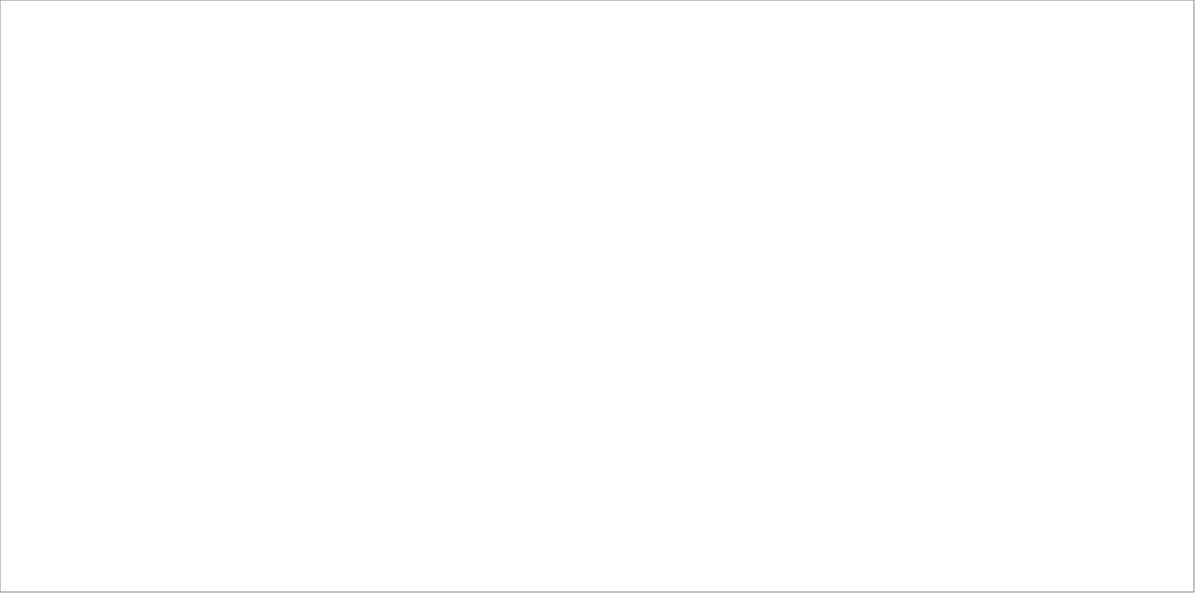
| Category | Series 0 |
|---|---|
| Meža ieaudzēšana, apmežošana  | 24 |
| Mežaudžu atjaunošana pēc ugunsgrēka, vējgāzes, snieglauzes u. tml.  | 21 |
| Stādmateriāla iegāde meža atjaunošanā, stādu aizsardzība pret meža dzīvnieku postījumiem | 17 |
| Apmācību un pieredzes apmaiņas pasākumi meža īpašniekiem Latvijā un ārzemēs  | 11 |
| Atbalsts meža īpašnieku kooperatīvu izveidei un darbībai  | 10 |
| Atbalsts jaunam meža īpašniekam, pārņemot īpašumu no vecākiem | 5 |
| Ātraudzīgu stādījumu (kārklu, baltalkšņu) ierīkošana šķeldas ieguvei | 7 |
| Meža meliorācijas sistēmu un ceļu uzlabošana, izbūve | 27 |
| Kompensācijas par valsts noteiktajiem mežsaimnieciskās darbības ierobežojumiem | 27 |
| Konsultācijas par meža apsaimniekošanu, apsaimniekošanas plānu izstrāde | 11 |
| Jaunaudžu kopšana, mazvērtīgu mežaudžu nomaiņa | 32 |
| Motorinstrumentu, īpaši meža darbiem piemērotas mazās un vidējas tehnikas iegāde | 18 |
| Atbalsts meža īpašnieka brīvprātīgi izvēlētām apsaimniekošanas metodēm, palielinot meža sociālās un vides vērtības, sākotnējai meža sertifikācijai | 10 |
| Valsts kredītatbalsts maziem, vidējiem meža īpašniekiem meža zemju iegādei, veicinot konsolidāciju | 6 |